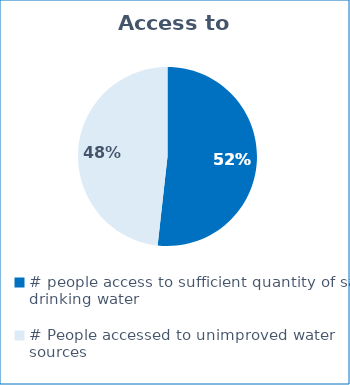
| Category | Series 0 |
|---|---|
| # people access to sufficient quantity of safe drinking water | 97870 |
| # People accessed to unimproved water sources | 91210 |